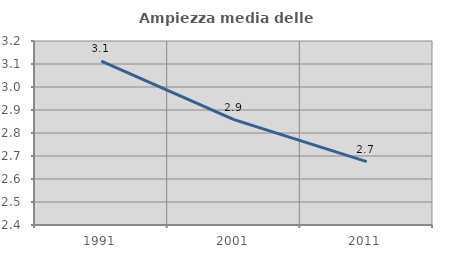
| Category | Ampiezza media delle famiglie |
|---|---|
| 1991.0 | 3.112 |
| 2001.0 | 2.858 |
| 2011.0 | 2.675 |